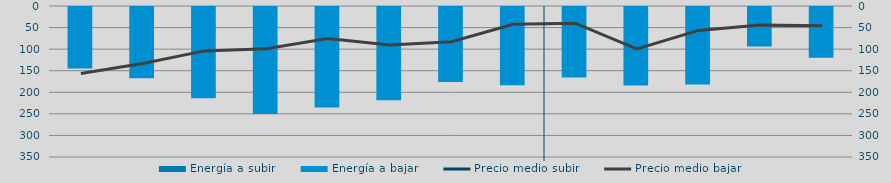
| Category | Energía a subir | Energía a bajar |
|---|---|---|
| M |  | 144.75 |
| J |  | 167.183 |
| J |  | 214.052 |
| A |  | 250.14 |
| S |  | 234.984 |
| O |  | 218.689 |
| N |  | 176.116 |
| D |  | 183.605 |
| E |  | 165.84 |
| F |  | 184.155 |
| M |  | 182.05 |
| A |  | 93.896 |
| M |  | 120.063 |